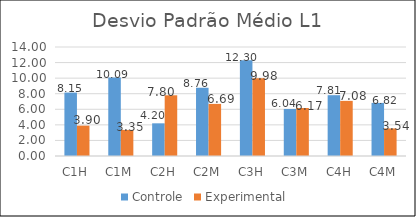
| Category | Controle | Experimental  |
|---|---|---|
| C1H | 8.146 | 3.9 |
| C1M | 10.087 | 3.346 |
| C2H | 4.197 | 7.797 |
| C2M | 8.762 | 6.693 |
| C3H | 12.295 | 9.977 |
| C3M | 6.042 | 6.167 |
| C4H | 7.81 | 7.081 |
| C4M | 6.821 | 3.54 |